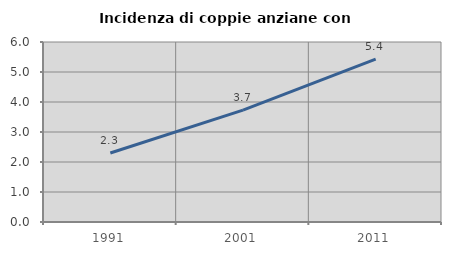
| Category | Incidenza di coppie anziane con figli |
|---|---|
| 1991.0 | 2.301 |
| 2001.0 | 3.73 |
| 2011.0 | 5.429 |